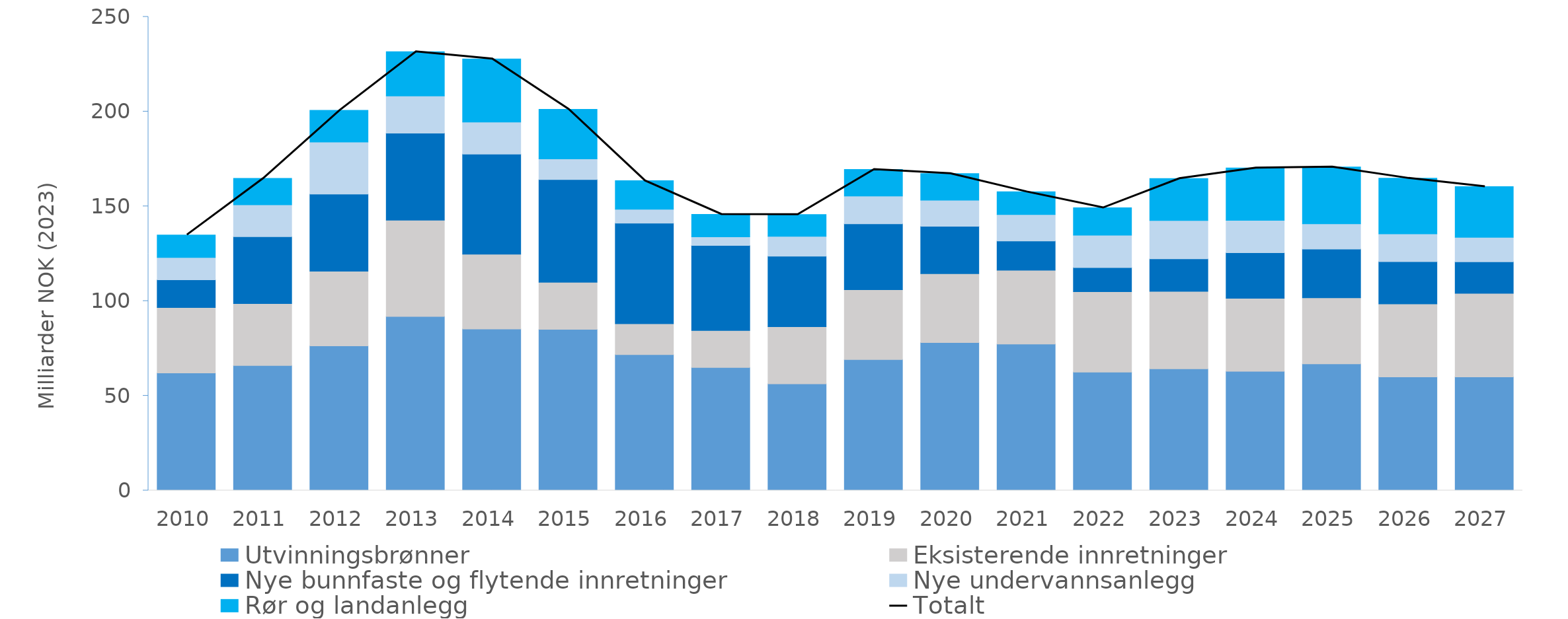
| Category | Utvinningsbrønner | Eksisterende innretninger | Nye bunnfaste og flytende innretninger | Nye undervannsanlegg | Rør og landanlegg |
|---|---|---|---|---|---|
| 2010.0 | 62.038 | 34.553 | 14.62 | 11.806 | 11.862 |
| 2011.0 | 65.978 | 32.684 | 35.311 | 16.852 | 13.906 |
| 2012.0 | 76.386 | 39.415 | 40.699 | 27.448 | 16.691 |
| 2013.0 | 91.905 | 50.775 | 45.937 | 19.63 | 23.367 |
| 2014.0 | 85.294 | 39.427 | 52.871 | 16.862 | 33.324 |
| 2015.0 | 85.086 | 24.791 | 54.303 | 10.812 | 26.219 |
| 2016.0 | 71.761 | 16.289 | 53.062 | 7.295 | 15.081 |
| 2017.0 | 64.923 | 19.527 | 44.866 | 4.616 | 11.828 |
| 2018.0 | 56.314 | 30.181 | 37.183 | 10.432 | 11.568 |
| 2019.0 | 69.14 | 36.829 | 34.81 | 14.651 | 14.007 |
| 2020.0 | 78.14 | 36.307 | 24.985 | 13.781 | 14.05 |
| 2021.0 | 77.282 | 39.001 | 15.393 | 14.006 | 11.966 |
| 2022.0 | 62.52 | 42.472 | 12.703 | 17.08 | 14.448 |
| 2023.0 | 64.204 | 40.936 | 17.133 | 20.26 | 22.134 |
| 2024.0 | 62.919 | 38.577 | 24.032 | 17.12 | 27.585 |
| 2025.0 | 66.844 | 34.846 | 25.728 | 13.336 | 29.976 |
| 2026.0 | 59.99 | 38.482 | 22.364 | 14.63 | 29.332 |
| 2027.0 | 59.985 | 44.08 | 16.693 | 12.884 | 26.717 |